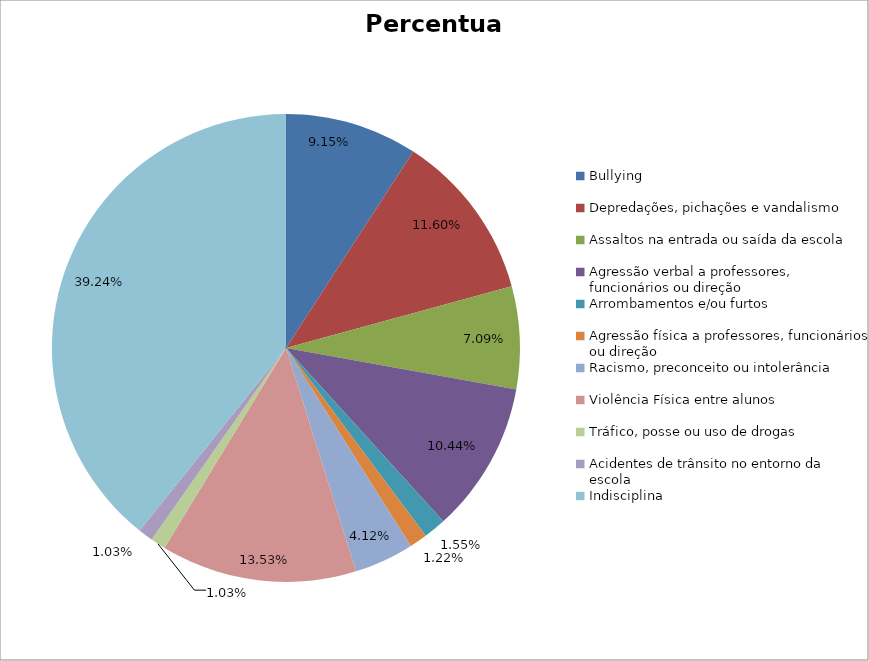
| Category | Percentual |
|---|---|
| Bullying | 0.091 |
| Depredações, pichações e vandalismo | 0.116 |
| Assaltos na entrada ou saída da escola | 0.071 |
| Agressão verbal a professores, funcionários ou direção | 0.104 |
| Arrombamentos e/ou furtos | 0.015 |
| Agressão física a professores, funcionários ou direção | 0.012 |
| Racismo, preconceito ou intolerância | 0.041 |
| Violência Física entre alunos | 0.135 |
| Tráfico, posse ou uso de drogas | 0.01 |
| Acidentes de trânsito no entorno da escola | 0.01 |
| Indisciplina | 0.392 |